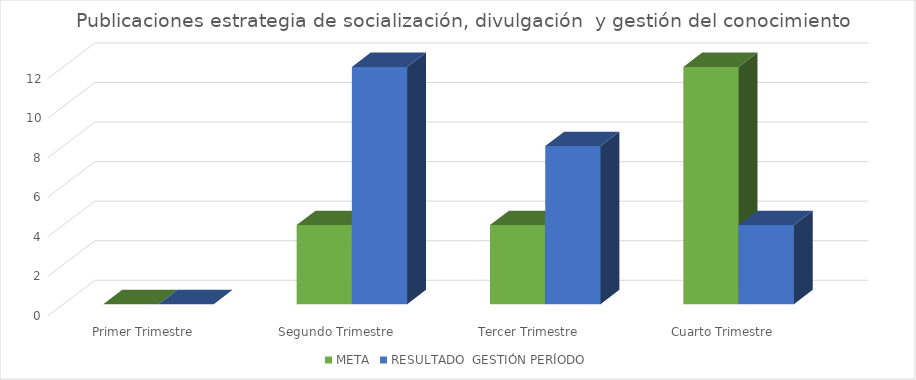
| Category | META | RESULTADO  GESTIÓN PERÍODO |
|---|---|---|
| Primer Trimestre | 0 | 0 |
| Segundo Trimestre | 4 | 12 |
| Tercer Trimestre | 4 | 8 |
| Cuarto Trimestre | 12 | 4 |